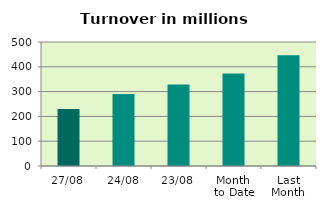
| Category | Series 0 |
|---|---|
| 27/08 | 229.642 |
| 24/08 | 290.561 |
| 23/08 | 328.372 |
| Month 
to Date | 372.591 |
| Last
Month | 446.279 |